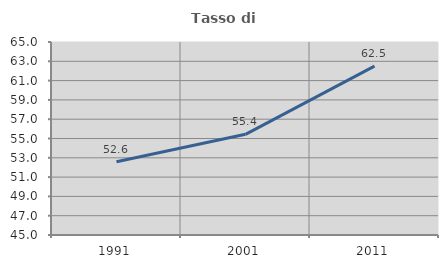
| Category | Tasso di occupazione   |
|---|---|
| 1991.0 | 52.587 |
| 2001.0 | 55.435 |
| 2011.0 | 62.497 |